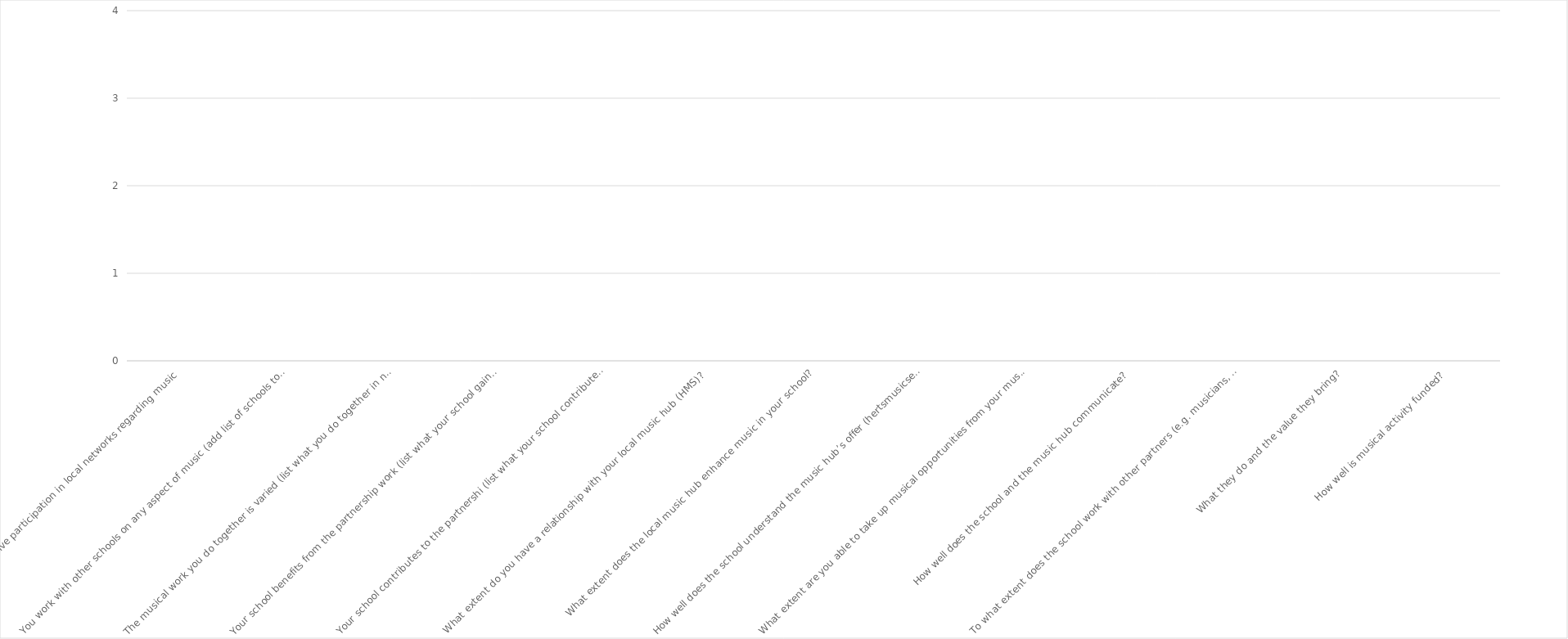
| Category | Series 0 |
|---|---|
| Your school has active participation in local networks regarding music | 0 |
| You work with other schools on any aspect of music (add list of schools to the notes section) | 0 |
| The musical work you do together is varied (list what you do together in notes section)  | 0 |
| Your school benefits from the partnership work (list what your school gains in the notes section)  | 0 |
| Your school contributes to the partnershi (list what your school contributes in the notes section)  | 0 |
| What extent do you have a relationship with your local music hub (HMS)?  | 0 |
| What extent does the local music hub enhance music in your school? | 0 |
| How well does the school understand the music hub’s offer (hertsmusicservice.org.uk) | 0 |
| What extent are you able to take up musical opportunities from your music hub? | 0 |
| How well does the school and the music hub communicate?  | 0 |
| To what extent does the school work with other partners (e.g. musicians, groups, music charities, national organisations)? | 0 |
| What they do and the value they bring? | 0 |
| How well is musical activity funded? | 0 |